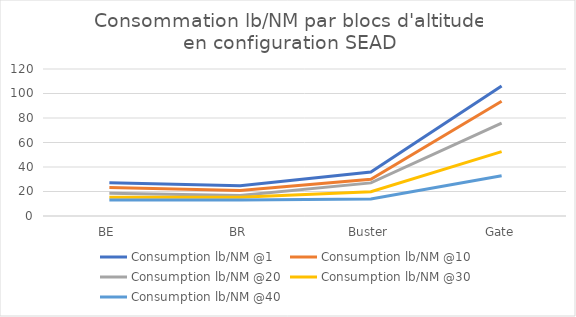
| Category | Consumption lb/NM @1 | Consumption lb/NM @10 | Consumption lb/NM @20 | Consumption lb/NM @30 | Consumption lb/NM @40 |
|---|---|---|---|---|---|
| BE | 27.092 | 23.239 | 18.619 | 15.385 | 12.971 |
| BR | 24.699 | 20.912 | 16.783 | 15.321 | 13.142 |
| Buster | 35.889 | 30.018 | 27.046 | 19.776 | 13.944 |
| Gate | 106.181 | 93.711 | 75.767 | 52.548 | 32.933 |